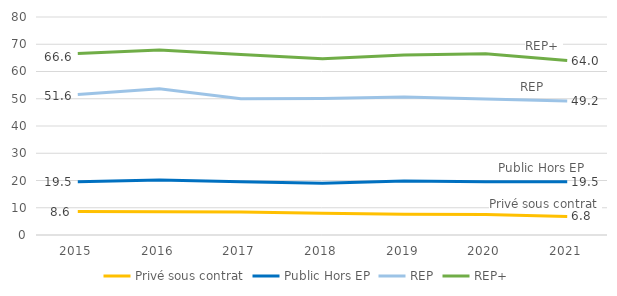
| Category | Privé sous contrat | Public Hors EP | REP | REP+ |
|---|---|---|---|---|
| 2015.0 | 8.6 | 19.5 | 51.6 | 66.6 |
| 2016.0 | 8.5 | 20.2 | 53.7 | 67.9 |
| 2017.0 | 8.4 | 19.5 | 50 | 66.2 |
| 2018.0 | 8 | 19 | 50.1 | 64.7 |
| 2019.0 | 7.6 | 19.8 | 50.6 | 66.1 |
| 2020.0 | 7.5 | 19.5 | 49.9 | 66.5 |
| 2021.0 | 6.8 | 19.5 | 49.2 | 64 |